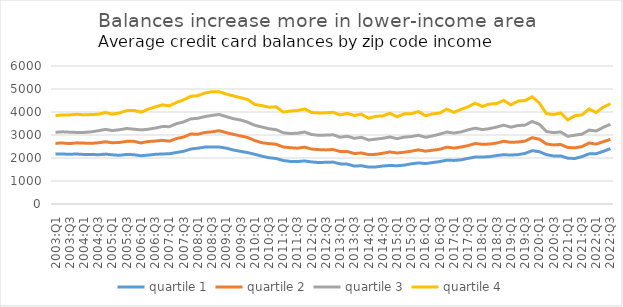
| Category | quartile 1 | quartile 2 | quartile 3 | quartile 4 |
|---|---|---|---|---|
| 2003:Q1 | 2179.441 | 2643.703 | 3118.413 | 3844.68 |
| 2003:Q2 | 2170.521 | 2650.497 | 3138.53 | 3873.363 |
| 2003:Q3 | 2165.009 | 2625.929 | 3122.765 | 3873.39 |
| 2003:Q4 | 2172.178 | 2659.136 | 3111.489 | 3902.092 |
| 2004:Q1 | 2153.214 | 2647.529 | 3111.993 | 3873.95 |
| 2004:Q2 | 2155.2 | 2637.208 | 3137.023 | 3890.713 |
| 2004:Q3 | 2141.116 | 2659.752 | 3185.21 | 3901.537 |
| 2004:Q4 | 2169.463 | 2705.888 | 3243.62 | 3978.053 |
| 2005:Q1 | 2137.832 | 2662.246 | 3192.972 | 3907.226 |
| 2005:Q2 | 2116.464 | 2676.85 | 3229.363 | 3960.553 |
| 2005:Q3 | 2154.803 | 2722.759 | 3283.235 | 4059.112 |
| 2005:Q4 | 2143.367 | 2724.094 | 3253.24 | 4070.517 |
| 2006:Q1 | 2098.279 | 2654.697 | 3220.784 | 3992.654 |
| 2006:Q2 | 2125.091 | 2717.102 | 3248.736 | 4120.583 |
| 2006:Q3 | 2159.37 | 2735.2 | 3300.476 | 4219.508 |
| 2006:Q4 | 2174.72 | 2768.057 | 3367.586 | 4311.294 |
| 2007:Q1 | 2184.091 | 2732.623 | 3362.233 | 4265.227 |
| 2007:Q2 | 2240.595 | 2846.262 | 3491.348 | 4417.134 |
| 2007:Q3 | 2291.889 | 2911.427 | 3569.154 | 4524.654 |
| 2007:Q4 | 2389.51 | 3041.436 | 3701.198 | 4682.699 |
| 2008:Q1 | 2426.054 | 3032.266 | 3727.111 | 4710.684 |
| 2008:Q2 | 2474.743 | 3108.595 | 3800.24 | 4823.29 |
| 2008:Q3 | 2473.003 | 3139.199 | 3852.322 | 4884.344 |
| 2008:Q4 | 2475.605 | 3187.263 | 3893.776 | 4879.633 |
| 2009:Q1 | 2430.173 | 3100.654 | 3797.663 | 4781.197 |
| 2009:Q2 | 2345.765 | 3028.569 | 3708.794 | 4699.542 |
| 2009:Q3 | 2290.347 | 2960.032 | 3653.482 | 4623.065 |
| 2009:Q4 | 2234.768 | 2890.483 | 3556.598 | 4542.935 |
| 2010:Q1 | 2161.483 | 2760.018 | 3420.131 | 4327.669 |
| 2010:Q2 | 2079.98 | 2662.472 | 3348.288 | 4279.576 |
| 2010:Q3 | 2011.03 | 2626.778 | 3271.762 | 4208.008 |
| 2010:Q4 | 1978.28 | 2597.633 | 3232.32 | 4224.55 |
| 2011:Q1 | 1891.824 | 2477.793 | 3097.309 | 3997.119 |
| 2011:Q2 | 1851.68 | 2448.158 | 3064.838 | 4043.307 |
| 2011:Q3 | 1846.65 | 2425.354 | 3076.774 | 4061.235 |
| 2011:Q4 | 1871.16 | 2471.578 | 3130.301 | 4132.472 |
| 2012:Q1 | 1827.497 | 2388.877 | 3021.409 | 3977.401 |
| 2012:Q2 | 1803.261 | 2363.667 | 2986.409 | 3959.553 |
| 2012:Q3 | 1813.341 | 2351.631 | 2996.084 | 3963.059 |
| 2012:Q4 | 1822.311 | 2369.48 | 3008.815 | 3991.482 |
| 2013:Q1 | 1744.392 | 2281.679 | 2903.353 | 3871.493 |
| 2013:Q2 | 1733.694 | 2283.339 | 2946.737 | 3940.824 |
| 2013:Q3 | 1647.774 | 2192.704 | 2856.24 | 3848.136 |
| 2013:Q4 | 1664.567 | 2219.197 | 2898.094 | 3908.205 |
| 2014:Q1 | 1602.889 | 2148.269 | 2783.711 | 3728.467 |
| 2014:Q2 | 1611.345 | 2159.703 | 2819.417 | 3814.525 |
| 2014:Q3 | 1650.7 | 2204.955 | 2857.27 | 3828.769 |
| 2014:Q4 | 1675.549 | 2262.774 | 2913.739 | 3944.929 |
| 2015:Q1 | 1663.122 | 2216.909 | 2840.687 | 3792.321 |
| 2015:Q2 | 1689.007 | 2249.617 | 2907.156 | 3920.998 |
| 2015:Q3 | 1745.106 | 2295.623 | 2931.046 | 3925.46 |
| 2015:Q4 | 1786.457 | 2354.531 | 2988.521 | 4016.694 |
| 2016:Q1 | 1758.096 | 2296.778 | 2901.064 | 3838.746 |
| 2016:Q2 | 1801.131 | 2338.09 | 2961.08 | 3918.223 |
| 2016:Q3 | 1844.293 | 2378.309 | 3037.485 | 3954.363 |
| 2016:Q4 | 1905.039 | 2472.072 | 3128.086 | 4123.939 |
| 2017:Q1 | 1894.729 | 2430.043 | 3083.029 | 3985.841 |
| 2017:Q2 | 1920.711 | 2477.068 | 3134.205 | 4116.382 |
| 2017:Q3 | 1984.513 | 2540.405 | 3224.438 | 4228.907 |
| 2017:Q4 | 2042.825 | 2631.145 | 3296.921 | 4383.747 |
| 2018:Q1 | 2039.897 | 2594.003 | 3234.46 | 4239.577 |
| 2018:Q2 | 2059.698 | 2607.134 | 3278.243 | 4347.609 |
| 2018:Q3 | 2104.557 | 2648.807 | 3345.842 | 4363.929 |
| 2018:Q4 | 2144.412 | 2728.246 | 3427.621 | 4506.869 |
| 2019:Q1 | 2127.405 | 2682.297 | 3341.782 | 4307.272 |
| 2019:Q2 | 2146.985 | 2694.618 | 3410.748 | 4473.146 |
| 2019:Q3 | 2198.867 | 2735.024 | 3430.259 | 4497.907 |
| 2019:Q4 | 2319.073 | 2883.99 | 3589.35 | 4663.473 |
| 2020:Q1 | 2274.318 | 2816.15 | 3462.881 | 4392.15 |
| 2020:Q2 | 2145.382 | 2608.515 | 3150.383 | 3930.162 |
| 2020:Q3 | 2087.806 | 2568.197 | 3102.751 | 3891.497 |
| 2020:Q4 | 2091.836 | 2587.611 | 3131.989 | 3957.444 |
| 2021:Q1 | 1991.788 | 2456.255 | 2944.742 | 3657.054 |
| 2021:Q2 | 1978.617 | 2444.207 | 2990.647 | 3840.249 |
| 2021:Q3 | 2059.886 | 2496.501 | 3036.269 | 3875.485 |
| 2021:Q4 | 2179.406 | 2652.223 | 3214.819 | 4130.85 |
| 2022:Q1 | 2189.42 | 2603.903 | 3172.639 | 3978.316 |
| 2022:Q2 | 2288.068 | 2709.535 | 3335.104 | 4214.398 |
| 2022:Q3 | 2408.712 | 2808.863 | 3465.613 | 4358.498 |